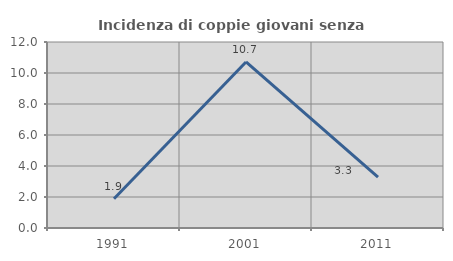
| Category | Incidenza di coppie giovani senza figli |
|---|---|
| 1991.0 | 1.887 |
| 2001.0 | 10.714 |
| 2011.0 | 3.279 |